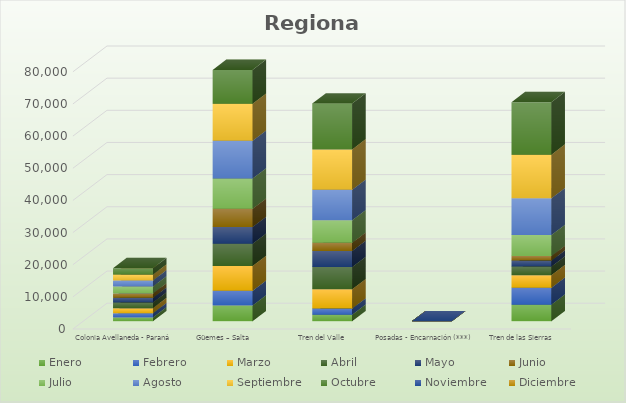
| Category | Enero | Febrero | Marzo | Abril | Mayo | Junio | Julio | Agosto | Septiembre | Octubre | Noviembre | Diciembre |
|---|---|---|---|---|---|---|---|---|---|---|---|---|
| Colonia Avellaneda - Paraná | 1204 | 1298 | 1578 | 1750 | 1479 | 1350 | 2166 | 1887 | 1795 | 2018 |  |  |
| Güemes – Salta | 4916 | 4539 | 7745 | 6891 | 5237 | 5641 | 9430 | 11736 | 11497 | 10547 |  |  |
| Tren del Valle | 2047 | 1901 | 5975 | 6945 | 5011 | 2557 | 6983 | 9474 | 12562 | 14266 |  |  |
| Posadas - Encarnación (***) | 0 | 0 | 0 | 0 | 0 | 0 | 0 | 0 | 0 | 0 |  |  |
| Tren de las Sierras | 5164 | 5258 | 3920 | 2660 | 1875 | 1415 | 6543 | 11427 | 13550 | 16330 |  |  |